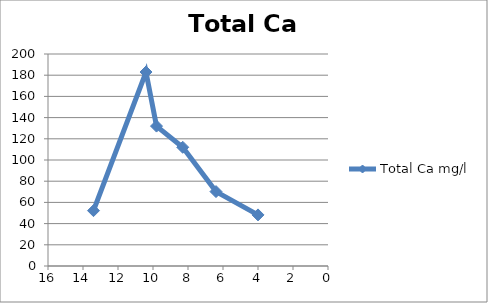
| Category | Total Ca mg/l |
|---|---|
| 13.4 | 52.2 |
| 10.4 | 183 |
| 9.8 | 132 |
| 8.3 | 112 |
| 6.4 | 70.2 |
| 4.0 | 48.2 |